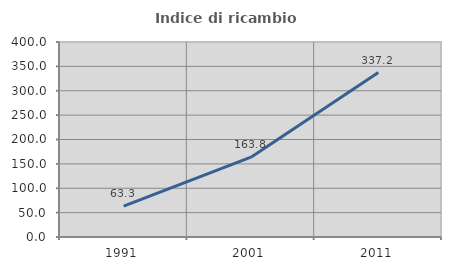
| Category | Indice di ricambio occupazionale  |
|---|---|
| 1991.0 | 63.333 |
| 2001.0 | 163.83 |
| 2011.0 | 337.209 |